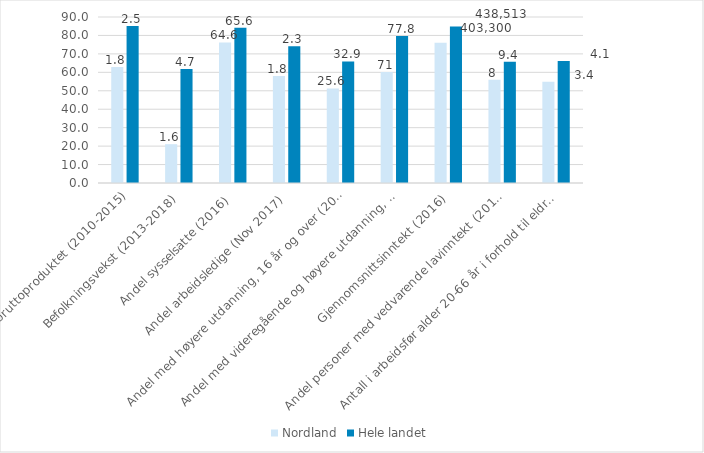
| Category | Nordland | Hele landet |
|---|---|---|
| Endring i bruttoproduktet (2010-2015) | 62.832 | 85.077 |
| Befolkningsvekst (2013-2018) | 21.053 | 61.842 |
| Andel sysselsatte (2016) | 76.19 | 84.127 |
| Andel arbeidsledige (Nov 2017) | 58.065 | 74.194 |
| Andel med høyere utdanning, 16 år og over (2016) | 51.303 | 65.932 |
| Andel med videregående og høyere utdanning, 25-29 år (2016) | 60.172 | 79.656 |
| Gjennomsnittsinntekt (2016) | 75.977 | 84.798 |
| Andel personer med vedvarende lavinntekt (2014-16) | 55.944 | 65.734 |
| Antall i arbeidsfør alder 20-66 år i forhold til eldre 67 år og over (2018) | 54.839 | 66.129 |